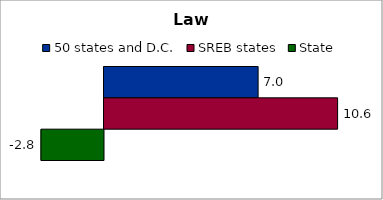
| Category | 50 states and D.C. | SREB states | State |
|---|---|---|---|
| 0 | 7.005 | 10.618 | -2.843 |